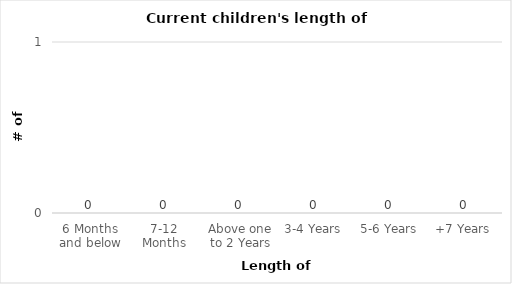
| Category | # of Children  |
|---|---|
| 6 Months and below | 0 |
| 7-12 Months | 0 |
| Above one to 2 Years | 0 |
| 3-4 Years | 0 |
| 5-6 Years | 0 |
| +7 Years | 0 |